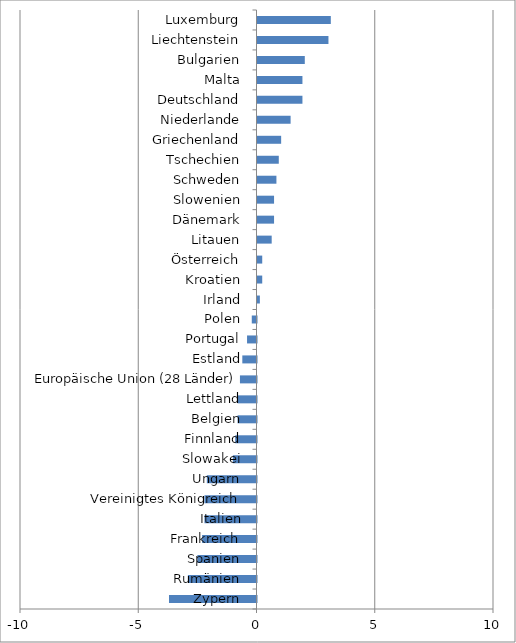
| Category | Series 0 |
|---|---|
| Zypern | -3.7 |
| Rumänien | -2.9 |
| Spanien | -2.5 |
| Frankreich | -2.3 |
| Italien | -2.2 |
| Vereinigtes Königreich | -2.2 |
| Ungarn | -2.1 |
| Slowakei | -1 |
| Finnland | -0.9 |
| Belgien | -0.8 |
| Lettland | -0.8 |
| Europäische Union (28 Länder) | -0.7 |
| Estland | -0.6 |
| Portugal | -0.4 |
| Polen | -0.2 |
| Irland | 0.1 |
| Kroatien | 0.2 |
| Österreich | 0.2 |
| Litauen | 0.6 |
| Dänemark | 0.7 |
| Slowenien | 0.7 |
| Schweden | 0.8 |
| Tschechien | 0.9 |
| Griechenland | 1 |
| Niederlande | 1.4 |
| Deutschland | 1.9 |
| Malta | 1.9 |
| Bulgarien | 2 |
| Liechtenstein | 3 |
| Luxemburg | 3.1 |